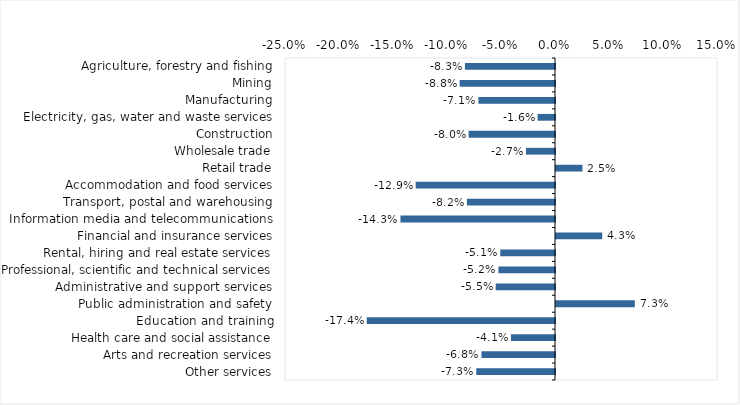
| Category | This week |
|---|---|
| Agriculture, forestry and fishing | -0.083 |
| Mining | -0.088 |
| Manufacturing | -0.071 |
| Electricity, gas, water and waste services | -0.016 |
| Construction | -0.08 |
| Wholesale trade | -0.027 |
| Retail trade | 0.024 |
| Accommodation and food services | -0.129 |
| Transport, postal and warehousing | -0.082 |
| Information media and telecommunications | -0.143 |
| Financial and insurance services | 0.043 |
| Rental, hiring and real estate services | -0.051 |
| Professional, scientific and technical services | -0.052 |
| Administrative and support services | -0.055 |
| Public administration and safety | 0.073 |
| Education and training | -0.174 |
| Health care and social assistance | -0.041 |
| Arts and recreation services | -0.068 |
| Other services | -0.073 |